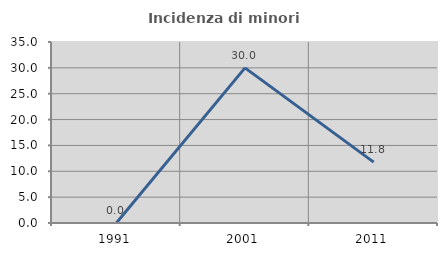
| Category | Incidenza di minori stranieri |
|---|---|
| 1991.0 | 0 |
| 2001.0 | 30 |
| 2011.0 | 11.765 |